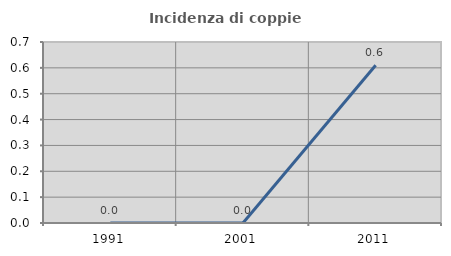
| Category | Incidenza di coppie miste |
|---|---|
| 1991.0 | 0 |
| 2001.0 | 0 |
| 2011.0 | 0.61 |